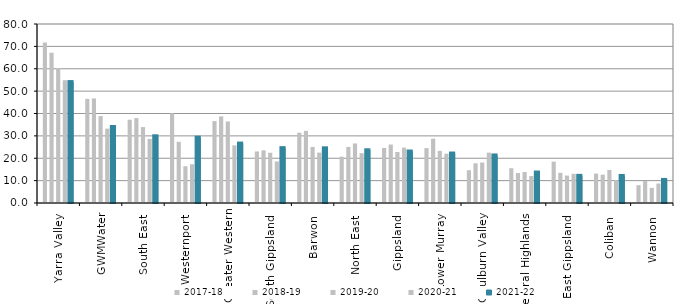
| Category | 2017-18 | 2018-19 | 2019-20 | 2020-21 | 2021-22 |
|---|---|---|---|---|---|
| Yarra Valley  | 71.723 | 67.173 | 60.347 | 54.872 | 54.049 |
| GWMWater | 46.534 | 46.744 | 38.827 | 33.233 | 33.958 |
| South East  | 37.223 | 37.928 | 33.919 | 28.649 | 29.813 |
| Westernport  | 40.095 | 27.35 | 16.424 | 17.327 | 29.202 |
| Greater Western | 36.607 | 38.707 | 36.444 | 25.766 | 26.564 |
| South Gippsland  | 23.034 | 23.553 | 22.446 | 18.567 | 24.521 |
| Barwon  | 31.408 | 32.24 | 25.056 | 22.529 | 24.441 |
| North East  | 20.703 | 25.076 | 26.605 | 22.277 | 23.561 |
| Gippsland  | 24.59 | 26.124 | 22.796 | 24.726 | 23.007 |
| Lower Murray  | 24.531 | 28.731 | 23.265 | 22.018 | 22.111 |
| Goulburn Valley  | 14.649 | 17.735 | 18.093 | 22.509 | 21.253 |
| Central Highlands  | 15.54 | 13.375 | 13.829 | 12.038 | 13.618 |
| East Gippsland  | 18.468 | 13.485 | 12.256 | 13.052 | 12.133 |
| Coliban  | 13.133 | 12.667 | 14.768 | 10.2 | 12.088 |
| Wannon  | 7.957 | 9.765 | 6.768 | 8.694 | 10.314 |